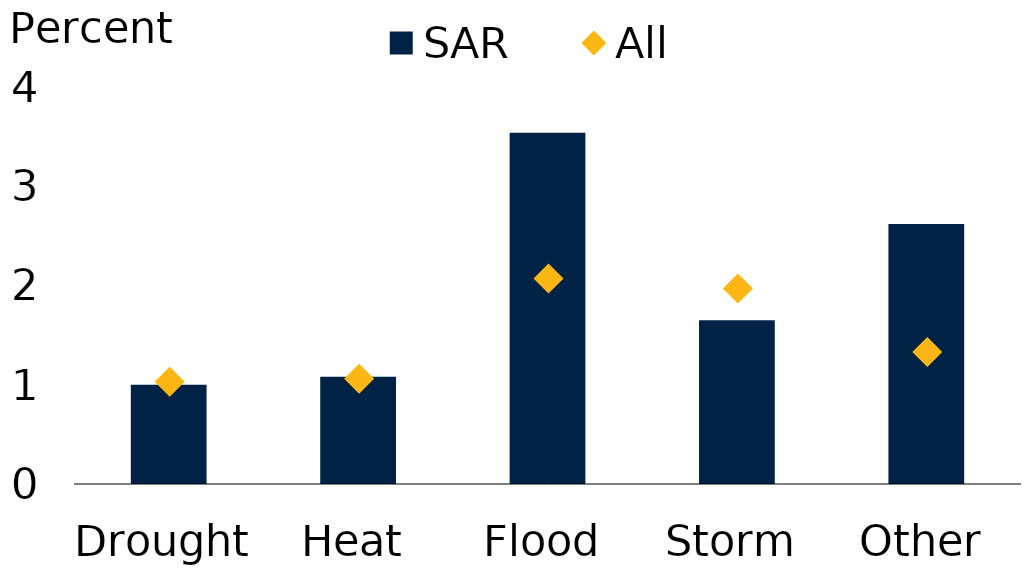
| Category | SAR |
|---|---|
| Drought | 1 |
| Heat | 1.08 |
| Flood | 3.54 |
| Storm | 1.65 |
| Other | 2.62 |